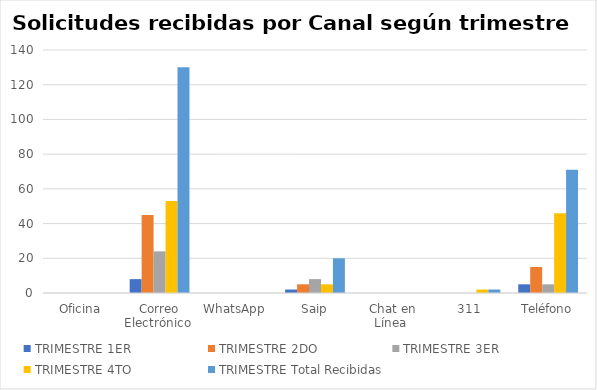
| Category | TRIMESTRE |
|---|---|
| Oficina | 0 |
| Correo Electrónico  | 130 |
| WhatsApp  | 0 |
| Saip | 20 |
| Chat en Línea  | 0 |
| 311 | 2 |
| Teléfono | 71 |